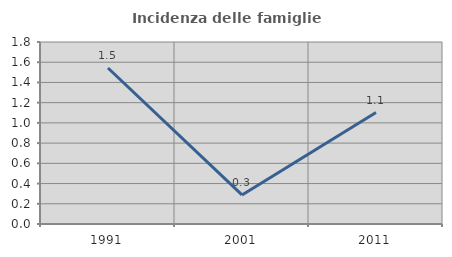
| Category | Incidenza delle famiglie numerose |
|---|---|
| 1991.0 | 1.543 |
| 2001.0 | 0.287 |
| 2011.0 | 1.102 |